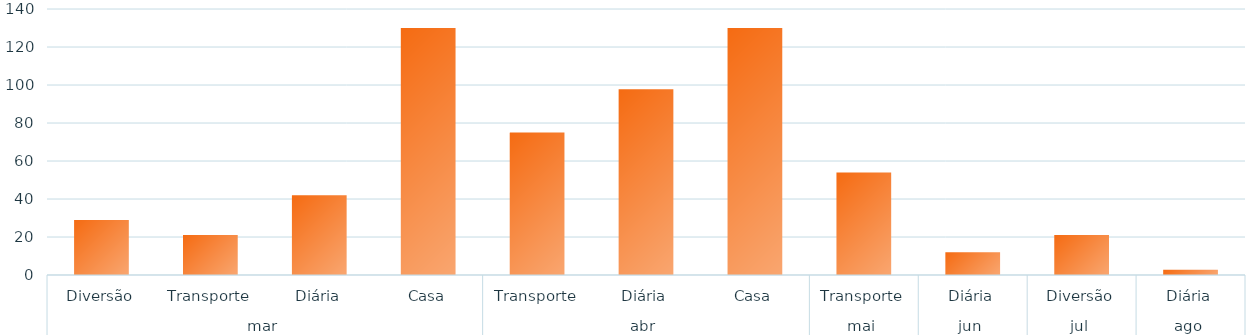
| Category | Total |
|---|---|
| 0 | 29 |
| 1 | 21 |
| 2 | 42 |
| 3 | 130 |
| 4 | 75 |
| 5 | 97.75 |
| 6 | 130 |
| 7 | 54 |
| 8 | 12 |
| 9 | 21 |
| 10 | 2.75 |